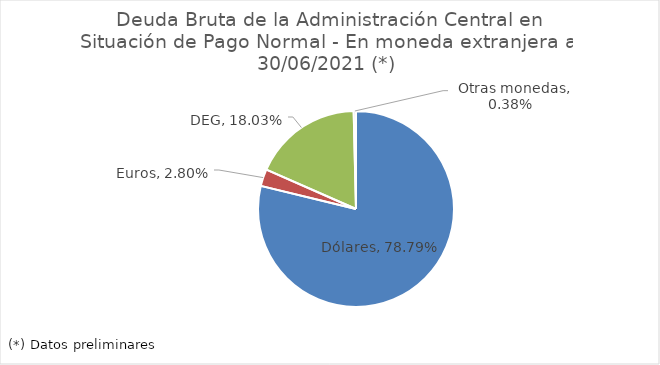
| Category | Series 0 |
|---|---|
|   Dólares | 0.788 |
|   Euros | 0.028 |
|   DEG | 0.18 |
|   Otras monedas | 0.004 |